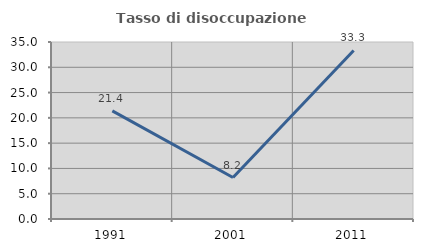
| Category | Tasso di disoccupazione giovanile  |
|---|---|
| 1991.0 | 21.379 |
| 2001.0 | 8.197 |
| 2011.0 | 33.333 |